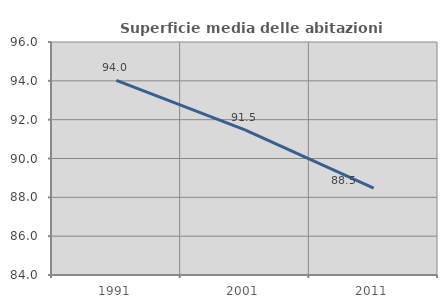
| Category | Superficie media delle abitazioni occupate |
|---|---|
| 1991.0 | 94.021 |
| 2001.0 | 91.471 |
| 2011.0 | 88.48 |